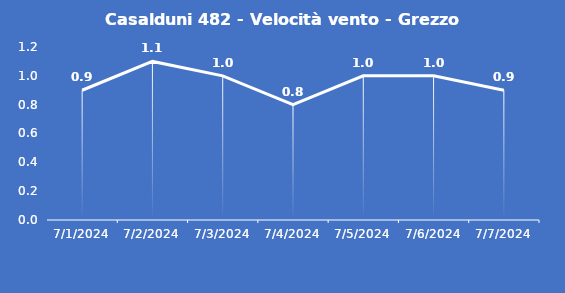
| Category | Casalduni 482 - Velocità vento - Grezzo (m/s) |
|---|---|
| 7/1/24 | 0.9 |
| 7/2/24 | 1.1 |
| 7/3/24 | 1 |
| 7/4/24 | 0.8 |
| 7/5/24 | 1 |
| 7/6/24 | 1 |
| 7/7/24 | 0.9 |